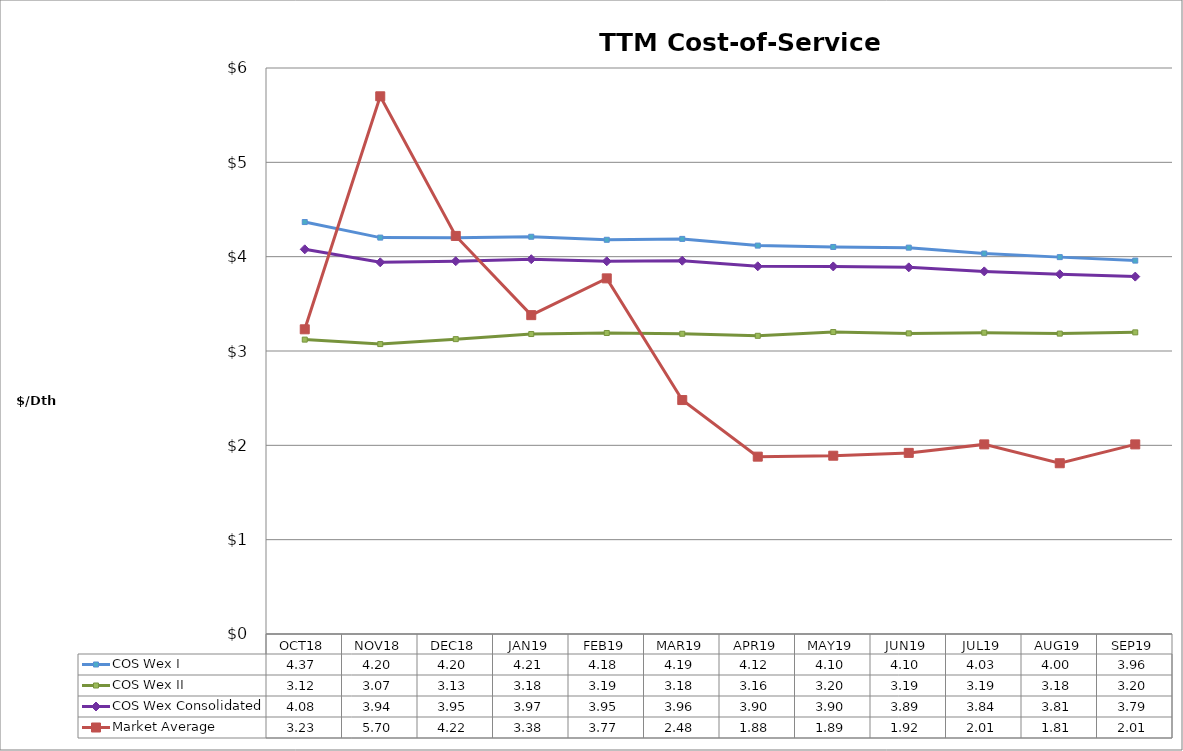
| Category | COS Wex I | COS Wex II | COS Wex Consolidated | Market Average |
|---|---|---|---|---|
| OCT18 | 4.367 | 3.121 | 4.078 | 3.23 |
| NOV18 | 4.202 | 3.073 | 3.94 | 5.7 |
| DEC18 | 4.202 | 3.126 | 3.952 | 4.22 |
| JAN19 | 4.211 | 3.18 | 3.973 | 3.38 |
| FEB19 | 4.179 | 3.191 | 3.951 | 3.77 |
| MAR19 | 4.188 | 3.183 | 3.957 | 2.48 |
| APR19 | 4.117 | 3.161 | 3.898 | 1.88 |
| MAY19 | 4.103 | 3.201 | 3.896 | 1.89 |
| JUN19 | 4.096 | 3.187 | 3.887 | 1.92 |
| JUL19 | 4.033 | 3.194 | 3.844 | 2.01 |
| AUG19 | 3.995 | 3.184 | 3.814 | 1.81 |
| SEP19 | 3.958 | 3.197 | 3.789 | 2.01 |